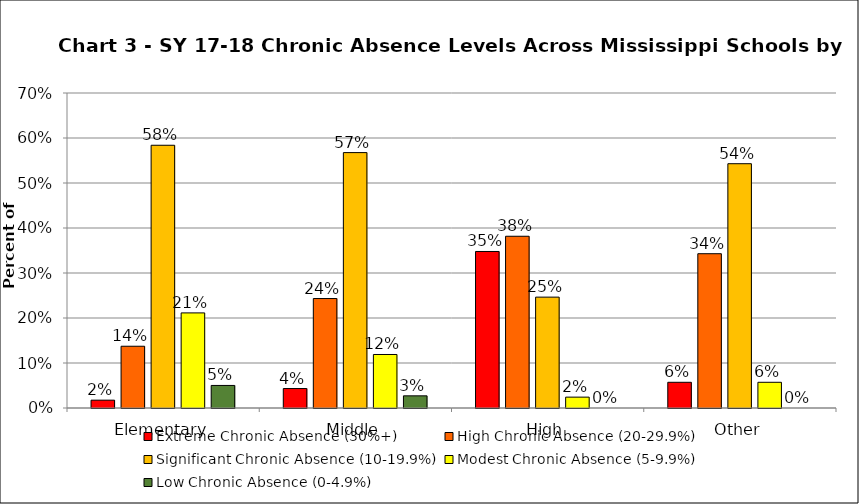
| Category | Extreme Chronic Absence (30%+) | High Chronic Absence (20-29.9%) | Significant Chronic Absence (10-19.9%) | Modest Chronic Absence (5-9.9%) | Low Chronic Absence (0-4.9%) |
|---|---|---|---|---|---|
| 0 | 0.017 | 0.137 | 0.584 | 0.211 | 0.05 |
| 1 | 0.043 | 0.243 | 0.568 | 0.119 | 0.027 |
| 2 | 0.348 | 0.382 | 0.246 | 0.024 | 0 |
| 3 | 0.057 | 0.343 | 0.543 | 0.057 | 0 |